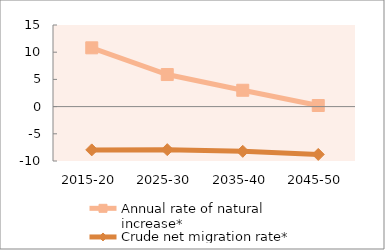
| Category | Annual rate of natural increase* | Crude net migration rate* |
|---|---|---|
| 2015-20 | 10.804 | -7.955 |
| 2025-30 | 5.894 | -7.916 |
| 2035-40 | 3.005 | -8.22 |
| 2045-50 | 0.202 | -8.794 |